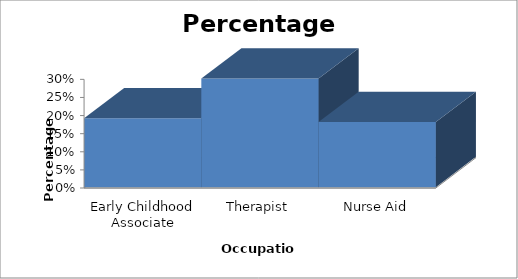
| Category | Series 0 |
|---|---|
| Early Childhood Associate | 0.19 |
| Therapist | 0.3 |
| Nurse Aid | 0.18 |